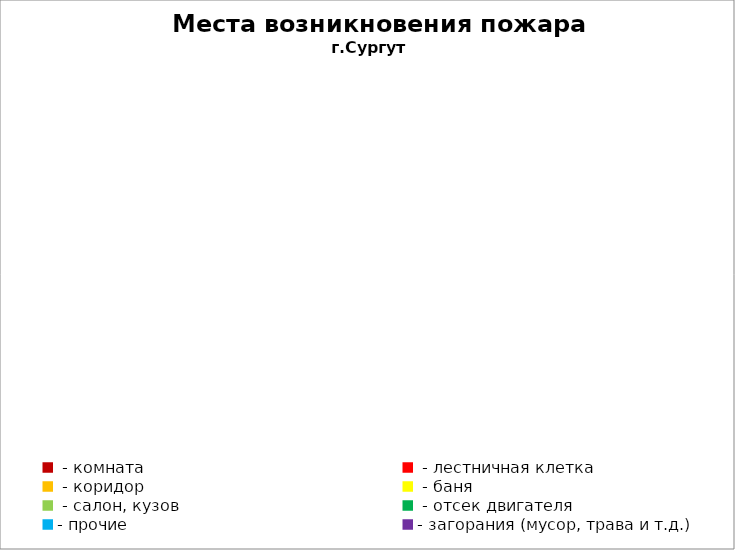
| Category | Места возникновения пожара |
|---|---|
|  - комната | 43 |
|  - лестничная клетка | 10 |
|  - коридор | 7 |
|  - баня | 22 |
|  - салон, кузов | 22 |
|  - отсек двигателя | 34 |
| - прочие | 127 |
| - загорания (мусор, трава и т.д.)  | 105 |